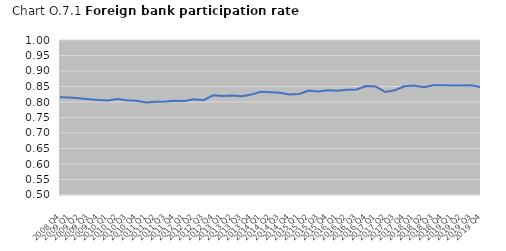
| Category | Series 0 |
|---|---|
| 2008 Q4 | 0.815 |
| 2009 Q1 | 0.814 |
| 2009 Q2 | 0.812 |
| 2009 Q3 | 0.809 |
| 2009 Q4 | 0.807 |
| 2010 Q1 | 0.805 |
| 2010 Q2 | 0.81 |
| 2010 Q3 | 0.806 |
| 2010 Q4 | 0.804 |
| 2011 Q1 | 0.798 |
| 2011 Q2 | 0.801 |
| 2011 Q3 | 0.802 |
| 2011 Q4 | 0.804 |
| 2012 Q1 | 0.803 |
| 2012 Q2 | 0.809 |
| 2012 Q3 | 0.806 |
| 2012 Q4 | 0.822 |
| 2013 Q1 | 0.819 |
| 2013 Q2 | 0.821 |
| 2013 Q3 | 0.819 |
| 2013 Q4 | 0.824 |
| 2014 Q1 | 0.833 |
| 2014 Q2 | 0.831 |
| 2014 Q3 | 0.83 |
| 2014 Q4 | 0.824 |
| 2015 Q1 | 0.826 |
| 2015 Q2 | 0.837 |
| 2015 Q3 | 0.834 |
| 2015 Q4 | 0.838 |
| 2016 Q1 | 0.836 |
| 2016 Q2 | 0.84 |
| 2016 Q3 | 0.84 |
| 2016 Q4 | 0.851 |
| 2017 Q1 | 0.85 |
| 2017 Q2 | 0.832 |
| 2017 Q3 | 0.838 |
| 2017 Q4 | 0.851 |
| 2018 Q1 | 0.853 |
| 2018 Q2 | 0.848 |
| 2018 Q3 | 0.854 |
| 2018 Q4 | 0.854 |
| 2019 Q1 | 0.853 |
| 2019 Q2 | 0.854 |
| 2019 Q3 | 0.854 |
| 2019 Q4 | 0.847 |